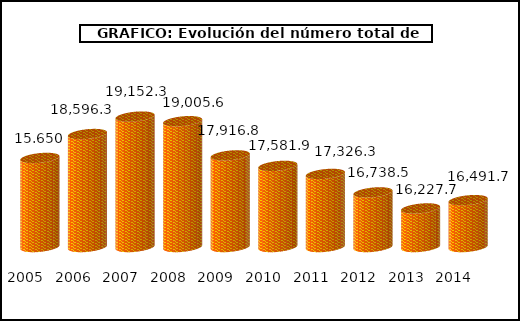
| Category | Series 0 |
|---|---|
| 2005.0 | 17835.4 |
| 2006.0 | 18596.3 |
| 2007.0 | 19152.3 |
| 2008.0 | 19005.6 |
| 2009.0 | 17916.8 |
| 2010.0 | 17581.9 |
| 2011.0 | 17326.3 |
| 2012.0 | 16738.5 |
| 2013.0 | 16227.7 |
| 2014.0 | 16491.7 |